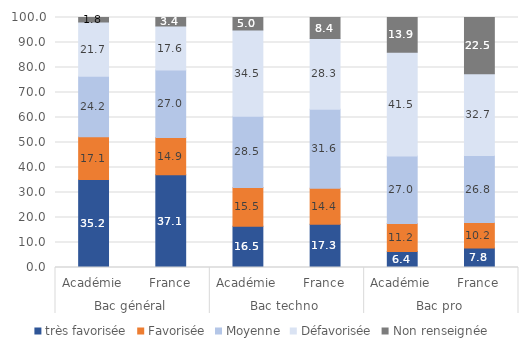
| Category | très favorisée | Favorisée | Moyenne | Défavorisée | Non renseignée |
|---|---|---|---|---|---|
| 0 | 35.2 | 17.1 | 24.2 | 21.7 | 1.8 |
| 1 | 37.1 | 14.9 | 27 | 17.6 | 3.4 |
| 2 | 16.5 | 15.5 | 28.5 | 34.5 | 5 |
| 3 | 17.3 | 14.4 | 31.6 | 28.3 | 8.4 |
| 4 | 6.4 | 11.2 | 27 | 41.5 | 13.9 |
| 5 | 7.8 | 10.2 | 26.8 | 32.7 | 22.5 |